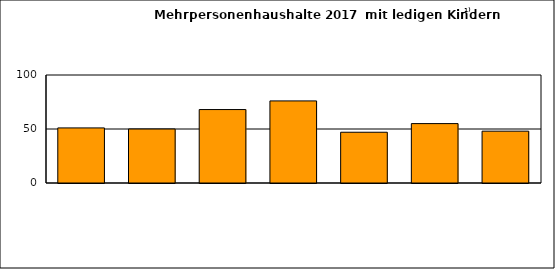
| Category | Series 0 |
|---|---|
| 0 | 51 |
| 1 | 50 |
| 2 | 68 |
| 3 | 76 |
| 4 | 47 |
| 5 | 55 |
| 6 | 48 |